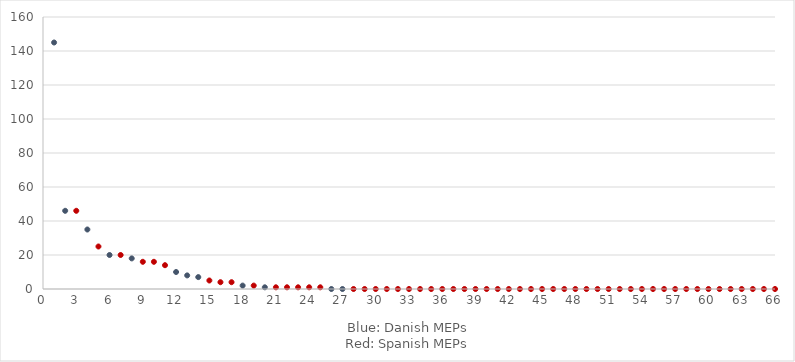
| Category | v14: Number of comments in own political posts |
|---|---|
| 0 | 145 |
| 1 | 46 |
| 2 | 46 |
| 3 | 35 |
| 4 | 25 |
| 5 | 20 |
| 6 | 20 |
| 7 | 18 |
| 8 | 16 |
| 9 | 16 |
| 10 | 14 |
| 11 | 10 |
| 12 | 8 |
| 13 | 7 |
| 14 | 5 |
| 15 | 4 |
| 16 | 4 |
| 17 | 2 |
| 18 | 2 |
| 19 | 1 |
| 20 | 1 |
| 21 | 1 |
| 22 | 1 |
| 23 | 1 |
| 24 | 1 |
| 25 | 0 |
| 26 | 0 |
| 27 | 0 |
| 28 | 0 |
| 29 | 0 |
| 30 | 0 |
| 31 | 0 |
| 32 | 0 |
| 33 | 0 |
| 34 | 0 |
| 35 | 0 |
| 36 | 0 |
| 37 | 0 |
| 38 | 0 |
| 39 | 0 |
| 40 | 0 |
| 41 | 0 |
| 42 | 0 |
| 43 | 0 |
| 44 | 0 |
| 45 | 0 |
| 46 | 0 |
| 47 | 0 |
| 48 | 0 |
| 49 | 0 |
| 50 | 0 |
| 51 | 0 |
| 52 | 0 |
| 53 | 0 |
| 54 | 0 |
| 55 | 0 |
| 56 | 0 |
| 57 | 0 |
| 58 | 0 |
| 59 | 0 |
| 60 | 0 |
| 61 | 0 |
| 62 | 0 |
| 63 | 0 |
| 64 | 0 |
| 65 | 0 |